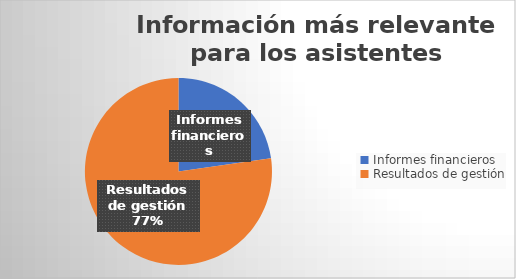
| Category | Series 0 |
|---|---|
| Informes financieros | 5 |
| Resultados de gestión | 17 |